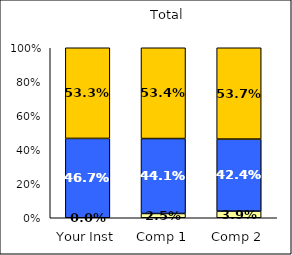
| Category | Low UG Ed Goal: Personal Development | Average UG Ed Goal: Personal Development | High UG Ed Goal: Personal Development |
|---|---|---|---|
| Your Inst | 0 | 0.467 | 0.533 |
| Comp 1 | 0.025 | 0.441 | 0.534 |
| Comp 2 | 0.039 | 0.424 | 0.537 |